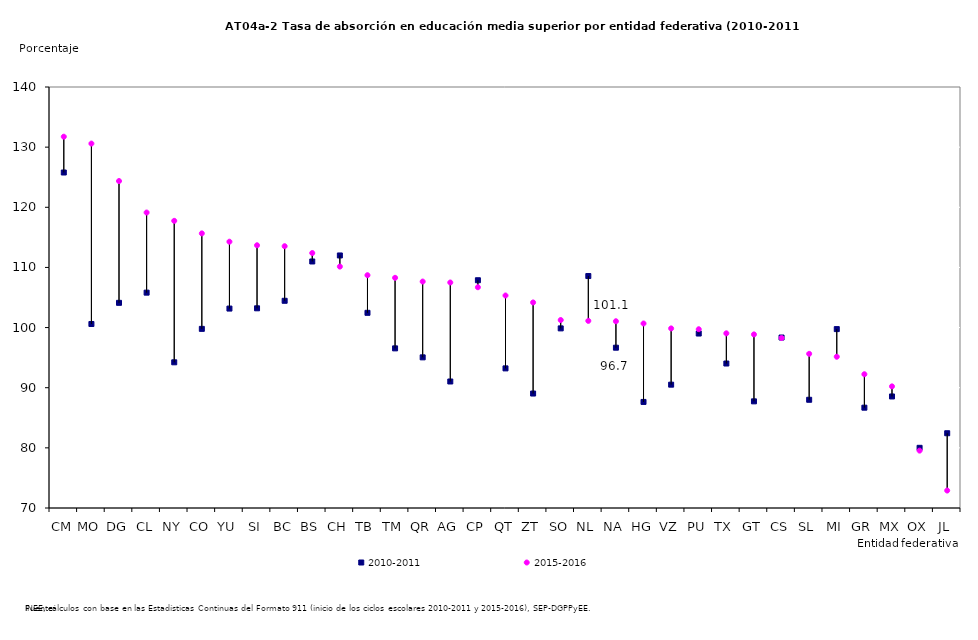
| Category | 2010-2011 | 2015-2016 |
|---|---|---|
| CM | 125.782 | 131.735 |
| MO | 100.595 | 130.594 |
| DG | 104.114 | 124.362 |
| CL | 105.808 | 119.128 |
| NY | 94.225 | 117.746 |
| CO | 99.784 | 115.662 |
| YU | 103.159 | 114.278 |
| SI | 103.203 | 113.683 |
| BC | 104.454 | 113.529 |
| BS | 110.989 | 112.395 |
| CH | 111.989 | 110.139 |
| TB | 102.453 | 108.705 |
| TM | 96.543 | 108.271 |
| QR | 95.048 | 107.65 |
| AG | 91.036 | 107.495 |
| CP | 107.871 | 106.708 |
| QT | 93.214 | 105.331 |
| ZT | 89.03 | 104.178 |
| SO | 99.865 | 101.254 |
| NL | 108.568 | 101.114 |
| NA | 96.653 | 101.051 |
| HG | 87.635 | 100.678 |
| VZ | 90.507 | 99.859 |
| PU | 99.008 | 99.721 |
| TX | 94.023 | 99.042 |
| GT | 87.733 | 98.864 |
| CS | 98.346 | 98.266 |
| SL | 87.994 | 95.634 |
| MI | 99.745 | 95.15 |
| GR | 86.679 | 92.242 |
| MX | 88.545 | 90.223 |
| OX | 80.005 | 79.54 |
| JL | 82.43 | 72.904 |